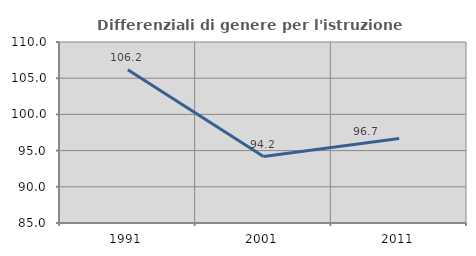
| Category | Differenziali di genere per l'istruzione superiore |
|---|---|
| 1991.0 | 106.178 |
| 2001.0 | 94.171 |
| 2011.0 | 96.665 |